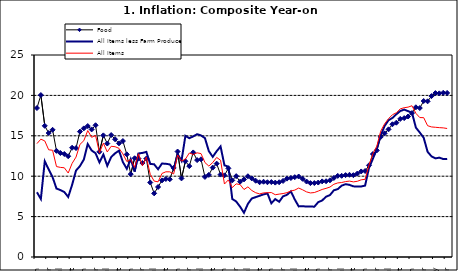
| Category | Food | All Items less Farm Produce | All Items |
|---|---|---|---|
| 09-Jan | 18.436 | 8.013 | 14.034 |
| Feb | 20.041 | 7.178 | 14.584 |
| Mar | 16.233 | 11.842 | 14.366 |
| Apr | 15.342 | 10.85 | 13.268 |
| May | 15.74 | 9.88 | 13.212 |
| June | 13.138 | 8.472 | 11.194 |
| Jul | 12.867 | 8.285 | 11.09 |
| Aug | 12.746 | 8.044 | 11.046 |
| Sep | 12.472 | 7.431 | 10.39 |
| Oct | 13.524 | 8.933 | 11.588 |
| Nov | 13.482 | 10.702 | 12.368 |
| Dec | 15.518 | 11.249 | 13.93 |
| 10-Jan | 15.918 | 12.063 | 14.398 |
| Feb | 16.208 | 13.978 | 15.649 |
| Mar | 15.79 | 13.184 | 14.812 |
| Apr | 16.306 | 12.844 | 15.044 |
| May | 13.023 | 11.711 | 12.915 |
| Jun | 15.053 | 12.686 | 14.099 |
| Jul | 14.043 | 11.287 | 13.002 |
| Aug | 15.09 | 12.366 | 13.702 |
| Sep | 14.57 | 12.83 | 13.65 |
| Oct | 14.065 | 13.168 | 13.45 |
| Nov | 14.351 | 11.746 | 12.766 |
| Dec | 12.701 | 10.917 | 11.815 |
| 11-Jan | 10.255 | 12.118 | 12.08 |
| Feb | 12.221 | 10.569 | 11.1 |
| Mar | 12.169 | 12.815 | 12.779 |
| Apr | 11.629 | 12.882 | 11.291 |
| May | 12.179 | 13.006 | 12.352 |
| Jun | 9.22 | 11.524 | 10.23 |
| Jul | 7.877 | 11.472 | 9.397 |
| Aug | 8.665 | 10.863 | 9.301 |
| Sep | 9.479 | 11.567 | 10.339 |
| Oct | 9.656 | 11.539 | 10.544 |
| Nov | 9.623 | 11.459 | 10.54 |
| Dec | 11.02 | 10.822 | 10.283 |
| 12-Jan | 13.053 | 12.748 | 12.626 |
| 12-Feb | 9.729 | 11.901 | 11.866 |
| 12-Mar | 11.848 | 14.995 | 12.111 |
| Apr | 11.246 | 14.703 | 12.866 |
| May | 12.942 | 14.926 | 12.688 |
| Jun | 11.991 | 15.199 | 12.892 |
| Jul | 12.093 | 15.045 | 12.797 |
| Aug | 9.91 | 14.714 | 11.689 |
| Sep | 10.164 | 13.101 | 11.253 |
| Oct | 11.064 | 12.398 | 11.693 |
| Nov | 11.553 | 13.092 | 12.32 |
| Dec | 10.199 | 13.685 | 11.981 |
| 13-Jan | 10.106 | 11.342 | 9.031 |
| Feb | 10.973 | 11.184 | 9.542 |
| Mar | 9.482 | 7.179 | 8.593 |
| Apr | 10.006 | 6.874 | 9.052 |
| May | 9.321 | 6.227 | 8.964 |
| Jun | 9.606 | 5.472 | 8.353 |
| Jul | 9.994 | 6.58 | 8.682 |
| Aug | 9.723 | 7.245 | 8.231 |
| Sep | 9.437 | 7.41 | 7.952 |
| Oct | 9.249 | 7.579 | 7.807 |
| Nov | 9.313 | 7.75 | 7.931 |
| Dec | 9.253 | 7.872 | 7.957 |
| 14-Jan | 9.271 | 6.648 | 7.977 |
| Feb | 9.207 | 7.166 | 7.707 |
| Mar | 9.254 | 6.836 | 7.783 |
| Apr | 9.414 | 7.508 | 7.851 |
| May | 9.698 | 7.693 | 7.965 |
| Jun | 9.776 | 8.122 | 8.167 |
| Jul | 9.878 | 7.116 | 8.281 |
| Aug | 9.959 | 6.264 | 8.534 |
| Sep | 9.676 | 6.278 | 8.317 |
| Oct | 9.343 | 6.252 | 8.06 |
| Nov | 9.144 | 6.255 | 7.927 |
| Dec | 9.152 | 6.225 | 7.978 |
| 15-Jan | 9.215 | 6.787 | 8.157 |
| Feb | 9.359 | 6.994 | 8.359 |
| Mar | 9.376 | 7.46 | 8.494 |
| Apr | 9.49 | 7.661 | 8.655 |
| May | 9.782 | 8.253 | 9.003 |
| Jun | 10.041 | 8.403 | 9.168 |
| Jul | 10.049 | 8.83 | 9.218 |
| Aug | 10.131 | 9.01 | 9.336 |
| Sep | 10.174 | 8.928 | 9.394 |
| Oct | 10.129 | 8.742 | 9.296 |
| Nov | 10.321 | 8.732 | 9.368 |
| Dec | 10.588 | 8.727 | 9.554 |
| 16-Jan | 10.642 | 8.841 | 9.617 |
| Feb | 11.348 | 11.041 | 11.379 |
| Mar | 12.745 | 12.17 | 12.775 |
| Apr | 13.194 | 13.352 | 13.721 |
| May | 14.861 | 15.054 | 15.577 |
| Jun | 15.302 | 16.224 | 16.48 |
| Jul | 15.799 | 16.929 | 17.127 |
| Aug | 16.427 | 17.208 | 17.609 |
| Sep | 16.622 | 17.666 | 17.852 |
| Oct | 17.09 | 18.067 | 18.33 |
| Nov | 17.191 | 18.241 | 18.476 |
| Dec | 17.388 | 18.052 | 18.547 |
| 17-Jan | 17.818 | 17.867 | 18.719 |
| Feb | 18.528 | 16.011 | 17.78 |
| Mar | 18.436 | 15.404 | 17.256 |
| Apr | 19.303 | 14.75 | 17.244 |
| May | 19.266 | 13.016 | 16.251 |
| June | 19.915 | 12.455 | 16.098 |
| July | 20.284 | 12.207 | 16.053 |
| August | 20.251 | 12.296 | 16.012 |
| September | 20.321 | 12.123 | 15.979 |
| October | 20.306 | 12.142 | 15.905 |